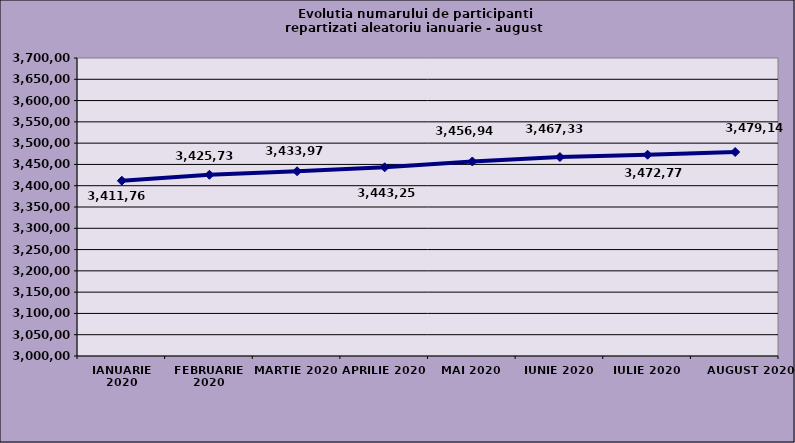
| Category | Series 0 |
|---|---|
| IANUARIE 2020 | 3411765 |
| FEBRUARIE 2020 | 3425735 |
| MARTIE 2020 | 3433979 |
| APRILIE 2020 | 3443256 |
| MAI 2020 | 3456948 |
| IUNIE 2020 | 3467335 |
| IULIE 2020 | 3472774 |
| AUGUST 2020 | 3479141 |